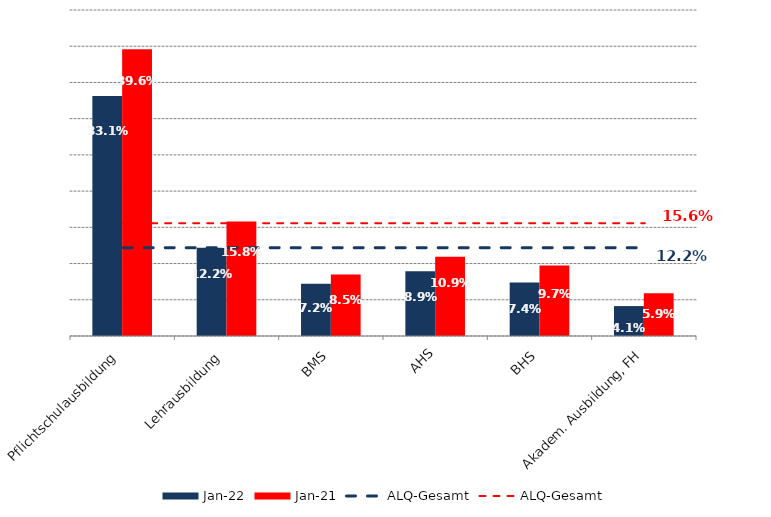
| Category | Jan 22 | Jan 21 |
|---|---|---|
| Pflichtschulausbildung | 0.331 | 0.396 |
| Lehrausbildung | 0.122 | 0.158 |
| BMS | 0.072 | 0.085 |
| AHS | 0.089 | 0.109 |
| BHS | 0.074 | 0.097 |
| Akadem. Ausbildung, FH | 0.041 | 0.059 |